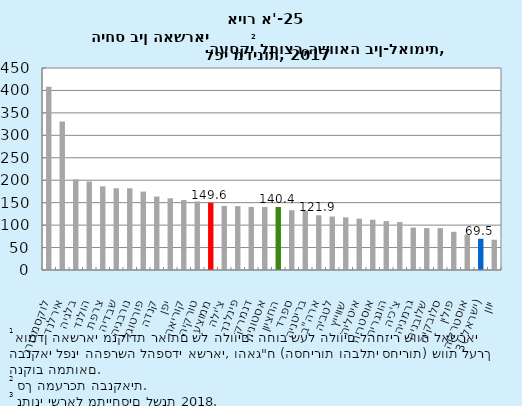
| Category | Series 0 |
|---|---|
| לוקסמבורג | 407.962 |
| אירלנד | 330.916 |
| בלגיה | 201.717 |
| הולנד | 197.122 |
| צרפת | 186.386 |
| שבדיה | 182.05 |
| נורבגיה | 182.033 |
| פורטוגל | 174.73 |
| קנדה | 163.628 |
| יפן | 159.766 |
| קוריאה | 155.83 |
| טורקיה | 152.726 |
| ממוצע | 149.642 |
| צ'ילה | 142.762 |
| פינלנד | 142.199 |
| דנמרק | 140.574 |
| אסטוניה | 140.275 |
| החציון | 140.425 |
| ספרד | 133.18 |
| בריטניה | 132.11 |
| ארה"ב | 121.867 |
| לטביה | 119.088 |
| שווייץ | 117.35 |
| איטליה | 114.306 |
| אוסטריה | 112.082 |
| הונגריה | 108.926 |
| צ'כיה | 106.806 |
| גרמניה | 94.375 |
| שלובניה | 93.398 |
| סלובקיה | 93.241 |
| פולין | 85.158 |
| אוסטרליה | 78.88 |
| ישראל (3) | 69.523 |
| יוון | 67.459 |